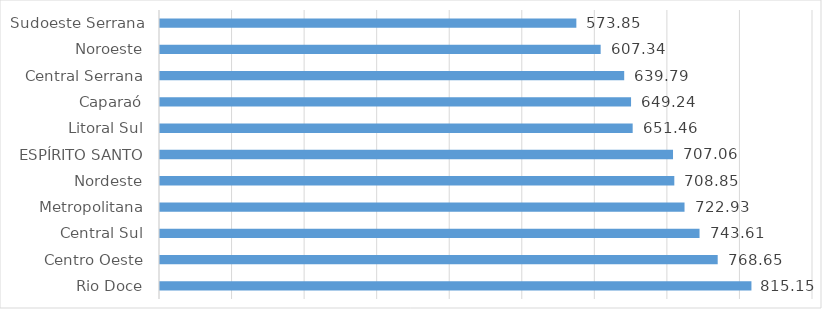
| Category | Series 0 |
|---|---|
| Rio Doce | 815.15 |
| Centro Oeste | 768.65 |
| Central Sul | 743.613 |
| Metropolitana | 722.935 |
| Nordeste | 708.852 |
| ESPÍRITO SANTO | 707.064 |
| Litoral Sul | 651.465 |
| Caparaó | 649.237 |
| Central Serrana | 639.786 |
| Noroeste | 607.337 |
| Sudoeste Serrana | 573.845 |